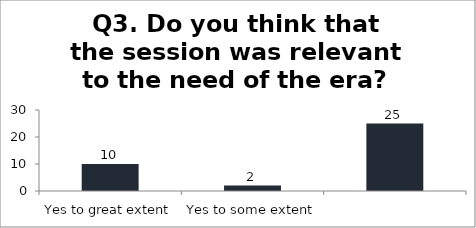
| Category | Q3. Do you think that the session was relevant to the need of the era? |
|---|---|
| Yes to great extent | 10 |
| Yes to some extent | 2 |